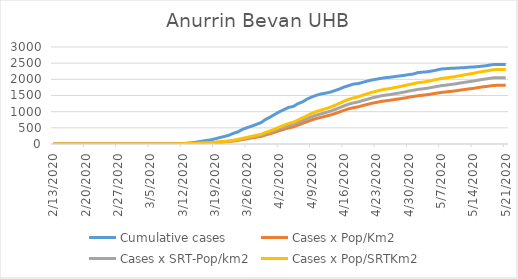
| Category | Cumulative cases | Cases x Pop/Km2 | Cases x SRT-Pop/km2 | Cases x Pop/SRTKm2 |
|---|---|---|---|---|
| 5/21/20 | 2462 | 1814.273 | 2052.214 | 2303.673 |
| 5/20/20 | 2462 | 1814.273 | 2052.214 | 2303.673 |
| 5/19/20 | 2462 | 1813.847 | 2051.731 | 2303.132 |
| 5/18/20 | 2453 | 1803.903 | 2040.483 | 2290.505 |
| 5/17/20 | 2427 | 1782.735 | 2016.54 | 2263.628 |
| 5/16/20 | 2408 | 1766.967 | 1998.703 | 2243.606 |
| 5/15/20 | 2394 | 1744.805 | 1973.635 | 2215.466 |
| 5/14/20 | 2382 | 1720.228 | 1945.835 | 2184.26 |
| 5/13/20 | 2375 | 1703.181 | 1926.551 | 2162.614 |
| 5/12/20 | 2361 | 1683.576 | 1904.376 | 2137.721 |
| 5/11/20 | 2355 | 1664.114 | 1882.361 | 2113.008 |
| 5/10/20 | 2345 | 1639.963 | 1855.043 | 2082.343 |
| 5/9/20 | 2340 | 1625.899 | 1839.134 | 2064.485 |
| 5/8/20 | 2330 | 1608.283 | 1819.208 | 2042.118 |
| 5/7/20 | 2319 | 1594.077 | 1803.139 | 2024.08 |
| 5/6/20 | 2285 | 1570.637 | 1776.625 | 1994.316 |
| 5/5/20 | 2257 | 1547.197 | 1750.11 | 1964.553 |
| 5/4/20 | 2233 | 1524.609 | 1724.56 | 1935.872 |
| 5/3/20 | 2222 | 1506.425 | 1703.991 | 1912.783 |
| 5/2/20 | 2209 | 1493.071 | 1688.886 | 1895.827 |
| 5/1/20 | 2164 | 1469.347 | 1662.05 | 1865.703 |
| 4/30/20 | 2146 | 1446.901 | 1636.661 | 1837.203 |
| 4/29/20 | 2122 | 1419.625 | 1605.808 | 1802.569 |
| 4/28/20 | 2105 | 1396.469 | 1579.615 | 1773.167 |
| 4/27/20 | 2085 | 1375.728 | 1556.153 | 1746.831 |
| 4/26/20 | 2065 | 1352.43 | 1529.8 | 1717.248 |
| 4/25/20 | 2052 | 1335.524 | 1510.677 | 1695.782 |
| 4/24/20 | 2031 | 1316.346 | 1488.984 | 1671.43 |
| 4/23/20 | 2004 | 1286.939 | 1455.72 | 1634.091 |
| 4/22/20 | 1979 | 1258.811 | 1423.903 | 1598.375 |
| 4/21/20 | 1945 | 1223.153 | 1383.569 | 1553.099 |
| 4/20/20 | 1906 | 1187.212 | 1342.914 | 1507.462 |
| 4/19/20 | 1867 | 1148.145 | 1298.723 | 1457.857 |
| 4/18/20 | 1854 | 1122.858 | 1270.119 | 1425.749 |
| 4/17/20 | 1805 | 1088.337 | 1231.071 | 1381.915 |
| 4/16/20 | 1763 | 1042.593 | 1179.328 | 1323.832 |
| 4/15/20 | 1701 | 991.592 | 1121.639 | 1259.075 |
| 4/14/20 | 1652 | 941.16 | 1064.593 | 1195.038 |
| 4/13/20 | 1605 | 897.121 | 1014.778 | 1139.12 |
| 4/12/20 | 1573 | 859.191 | 971.873 | 1090.957 |
| 4/11/20 | 1548 | 824.67 | 932.824 | 1047.124 |
| 4/10/20 | 1508 | 790.006 | 893.615 | 1003.111 |
| 4/9/20 | 1455 | 747.388 | 845.407 | 948.996 |
| 4/8/20 | 1391 | 691.984 | 782.737 | 878.646 |
| 4/7/20 | 1303 | 637.574 | 721.191 | 809.56 |
| 4/6/20 | 1248 | 584.159 | 660.771 | 741.736 |
| 4/5/20 | 1162 | 530.317 | 599.868 | 673.37 |
| 4/4/20 | 1133 | 498.922 | 564.355 | 633.506 |
| 4/3/20 | 1065 | 459.002 | 519.2 | 582.818 |
| 4/2/20 | 998 | 412.974 | 467.135 | 524.374 |
| 4/1/20 | 918 | 365.667 | 413.624 | 464.306 |
| 3/31/20 | 834 | 320.208 | 362.203 | 406.584 |
| 3/30/20 | 761 | 281.709 | 318.655 | 357.7 |
| 3/29/20 | 661 | 234.26 | 264.983 | 297.452 |
| 3/28/20 | 607 | 212.098 | 239.915 | 269.312 |
| 3/27/20 | 554 | 188.516 | 213.24 | 239.368 |
| 3/26/20 | 507 | 162.235 | 183.512 | 205.998 |
| 3/25/20 | 454 | 137.516 | 155.551 | 174.611 |
| 3/24/20 | 375 | 111.519 | 126.144 | 141.601 |
| 3/23/20 | 330 | 92.34 | 104.451 | 117.249 |
| 3/22/20 | 269 | 73.872 | 83.56 | 93.799 |
| 3/21/20 | 231 | 63.076 | 71.348 | 80.09 |
| 3/20/20 | 197 | 52.421 | 59.296 | 66.561 |
| 3/19/20 | 158 | 42.192 | 47.726 | 53.574 |
| 3/18/20 | 125 | 33.669 | 38.084 | 42.751 |
| 3/17/20 | 106 | 28.697 | 32.46 | 36.437 |
| 3/16/20 | 82 | 23.44 | 26.514 | 29.763 |
| 3/15/20 | 59 | 18.61 | 21.051 | 23.63 |
| 3/14/20 | 37 | 14.49 | 16.391 | 18.399 |
| 3/13/20 | 25 | 11.791 | 13.338 | 14.972 |
| 3/12/20 | 13 | 7.955 | 8.999 | 10.101 |
| 3/11/20 | 6 | 4.546 | 5.142 | 5.772 |
| 3/10/20 | 1 | 2.557 | 2.892 | 3.247 |
| 3/9/20 | 0 | 0.994 | 1.125 | 1.263 |
| 3/8/20 | 0 | 0.568 | 0.643 | 0.722 |
| 3/7/20 | 0 | 0.568 | 0.643 | 0.722 |
| 3/6/20 | 0 | 0.284 | 0.321 | 0.361 |
| 3/5/20 | 0 | 0.284 | 0.321 | 0.361 |
| 3/4/20 | 0 | 0.284 | 0.321 | 0.361 |
| 3/3/20 | 0 | 0.142 | 0.161 | 0.18 |
| 3/2/20 | 0 | 0.142 | 0.161 | 0.18 |
| 3/1/20 | 0 | 0.142 | 0.161 | 0.18 |
| 2/29/20 | 0 | 0.142 | 0.161 | 0.18 |
| 2/28/20 | 0 | 0.142 | 0.161 | 0.18 |
| 2/27/20 | 0 | 0.142 | 0.161 | 0.18 |
| 2/26/20 | 0 | 0 | 0 | 0 |
| 2/25/20 | 0 | 0 | 0 | 0 |
| 2/24/20 | 0 | 0 | 0 | 0 |
| 2/23/20 | 0 | 0 | 0 | 0 |
| 2/22/20 | 0 | 0 | 0 | 0 |
| 2/21/20 | 0 | 0 | 0 | 0 |
| 2/20/20 | 0 | 0 | 0 | 0 |
| 2/19/20 | 0 | 0 | 0 | 0 |
| 2/18/20 | 0 | 0 | 0 | 0 |
| 2/17/20 | 0 | 0 | 0 | 0 |
| 2/16/20 | 0 | 0 | 0 | 0 |
| 2/15/20 | 0 | 0 | 0 | 0 |
| 2/14/20 | 0 | 0 | 0 | 0 |
| 2/13/20 | 0 | 0 | 0 | 0 |